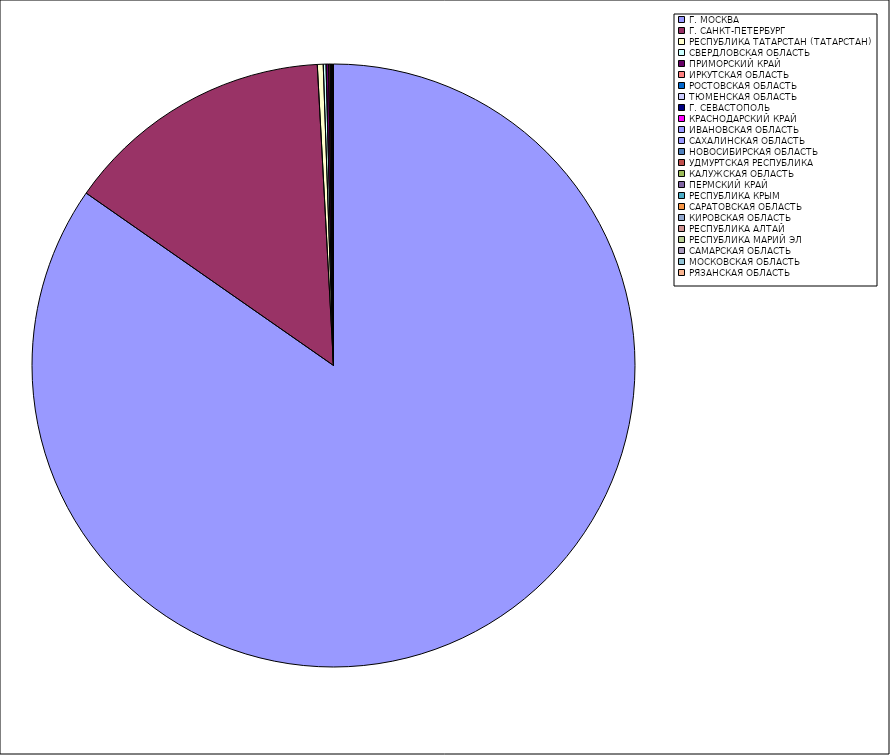
| Category | Оборот |
|---|---|
| Г. МОСКВА | 84.677 |
| Г. САНКТ-ПЕТЕРБУРГ | 14.453 |
| РЕСПУБЛИКА ТАТАРСТАН (ТАТАРСТАН) | 0.314 |
| СВЕРДЛОВСКАЯ ОБЛАСТЬ | 0.148 |
| ПРИМОРСКИЙ КРАЙ | 0.138 |
| ИРКУТСКАЯ ОБЛАСТЬ | 0.075 |
| РОСТОВСКАЯ ОБЛАСТЬ | 0.039 |
| ТЮМЕНСКАЯ ОБЛАСТЬ | 0.038 |
| Г. СЕВАСТОПОЛЬ | 0.024 |
| КРАСНОДАРСКИЙ КРАЙ | 0.019 |
| ИВАНОВСКАЯ ОБЛАСТЬ | 0.01 |
| САХАЛИНСКАЯ ОБЛАСТЬ | 0.009 |
| НОВОСИБИРСКАЯ ОБЛАСТЬ | 0.008 |
| УДМУРТСКАЯ РЕСПУБЛИКА | 0.005 |
| КАЛУЖСКАЯ ОБЛАСТЬ | 0.004 |
| ПЕРМСКИЙ КРАЙ | 0.004 |
| РЕСПУБЛИКА КРЫМ | 0.004 |
| САРАТОВСКАЯ ОБЛАСТЬ | 0.003 |
| КИРОВСКАЯ ОБЛАСТЬ | 0.003 |
| РЕСПУБЛИКА АЛТАЙ | 0.003 |
| РЕСПУБЛИКА МАРИЙ ЭЛ | 0.002 |
| САМАРСКАЯ ОБЛАСТЬ | 0.002 |
| МОСКОВСКАЯ ОБЛАСТЬ | 0.002 |
| РЯЗАНСКАЯ ОБЛАСТЬ | 0.002 |